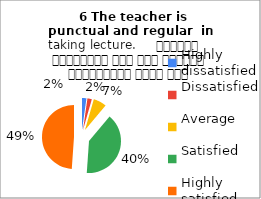
| Category |    6 The teacher is 
punctual and regular  in taking lecture.     शिक्षक समयनिष्ठ हैं एवं नियमित व्याख्यान देते हैं |
|---|---|
| Highly dissatisfied | 2 |
| Dissatisfied | 2 |
| Average | 6 |
| Satisfied | 36 |
| Highly satisfied | 44 |